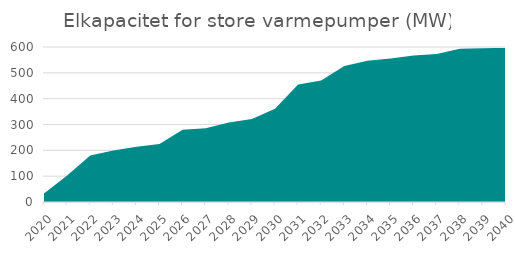
| Category | Series 0 |
|---|---|
| 2020.0 | 33.166 |
| 2021.0 | 103.013 |
| 2022.0 | 180.032 |
| 2023.0 | 198.917 |
| 2024.0 | 213.481 |
| 2025.0 | 224.587 |
| 2026.0 | 279.36 |
| 2027.0 | 285.135 |
| 2028.0 | 307.534 |
| 2029.0 | 321.087 |
| 2030.0 | 361.039 |
| 2031.0 | 454.814 |
| 2032.0 | 470.241 |
| 2033.0 | 526.521 |
| 2034.0 | 546.915 |
| 2035.0 | 555.404 |
| 2036.0 | 567.066 |
| 2037.0 | 572.691 |
| 2038.0 | 593.515 |
| 2039.0 | 595.221 |
| 2040.0 | 596.926 |